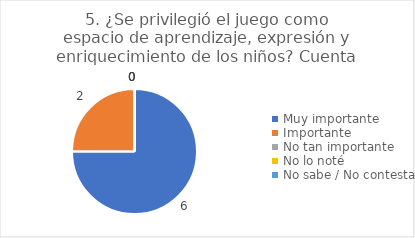
| Category | 5. ¿Se privilegió el juego como espacio de aprendizaje, expresión y enriquecimiento de los niños? |
|---|---|
| Muy importante  | 0.75 |
| Importante  | 0.25 |
| No tan importante  | 0 |
| No lo noté  | 0 |
| No sabe / No contesta | 0 |